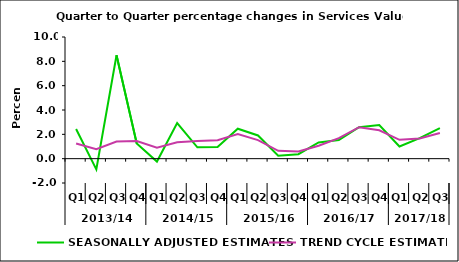
| Category | SEASONALLY ADJUSTED ESTIMATES | TREND CYCLE ESTIMATES |
|---|---|---|
| 0 | 2.438 | 1.241 |
| 1 | -0.885 | 0.773 |
| 2 | 8.5 | 1.402 |
| 3 | 1.245 | 1.452 |
| 4 | -0.238 | 0.908 |
| 5 | 2.928 | 1.352 |
| 6 | 0.936 | 1.447 |
| 7 | 0.963 | 1.508 |
| 8 | 2.463 | 2.016 |
| 9 | 1.909 | 1.526 |
| 10 | 0.247 | 0.641 |
| 11 | 0.367 | 0.594 |
| 12 | 1.331 | 1.064 |
| 13 | 1.537 | 1.684 |
| 14 | 2.583 | 2.588 |
| 15 | 2.767 | 2.333 |
| 16 | 1.004 | 1.552 |
| 17 | 1.687 | 1.662 |
| 18 | 2.517 | 2.111 |